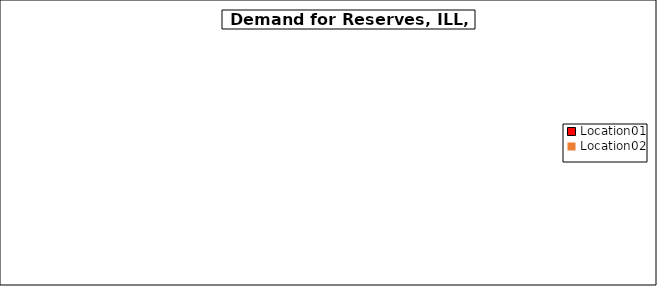
| Category | Data A |
|---|---|
| Location01 | 0 |
| Location02 | 0 |